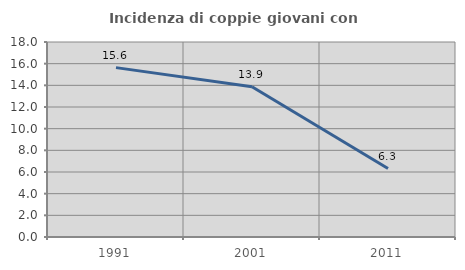
| Category | Incidenza di coppie giovani con figli |
|---|---|
| 1991.0 | 15.633 |
| 2001.0 | 13.874 |
| 2011.0 | 6.322 |